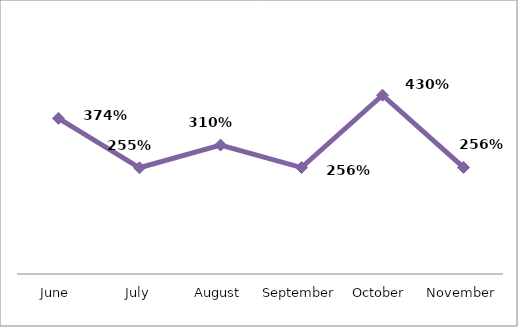
| Category | PERCENTAGE |
|---|---|
| June | 3.742 |
| July | 2.554 |
| August | 3.1 |
| September | 2.559 |
| October | 4.297 |
| November | 2.561 |